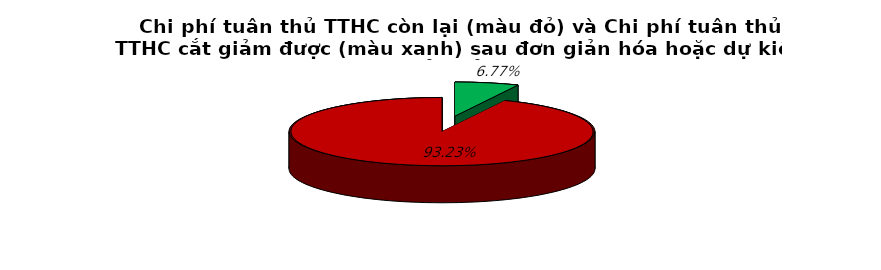
| Category | 6.8% 93.2% |
|---|---|
| 0 | 0.068 |
| 1 | 0.932 |